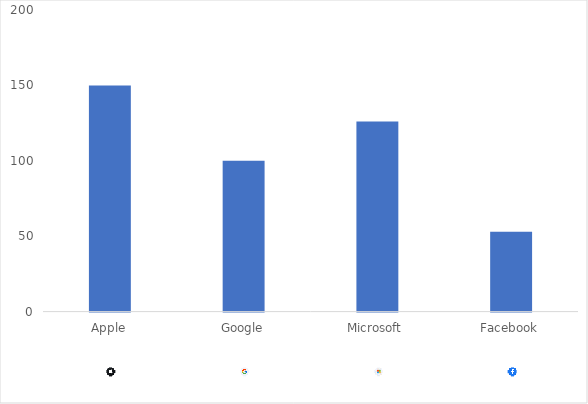
| Category | Стоимость, трлн.$ |
|---|---|
| Apple | 150 |
| Google | 100 |
| Microsoft | 126 |
| Facebook | 53 |